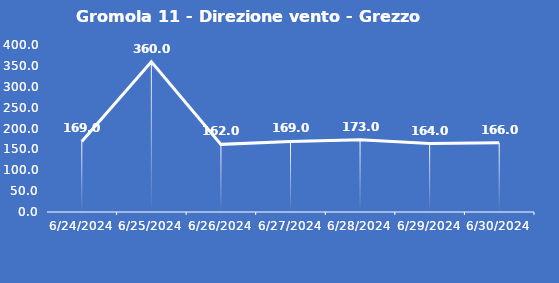
| Category | Gromola 11 - Direzione vento - Grezzo (°N) |
|---|---|
| 6/24/24 | 169 |
| 6/25/24 | 360 |
| 6/26/24 | 162 |
| 6/27/24 | 169 |
| 6/28/24 | 173 |
| 6/29/24 | 164 |
| 6/30/24 | 166 |